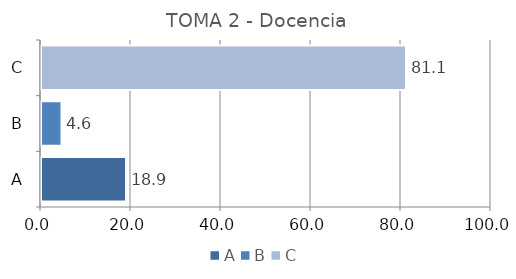
| Category | Series 0 |
|---|---|
| A | 18.9 |
| B | 4.55 |
| C | 81.1 |